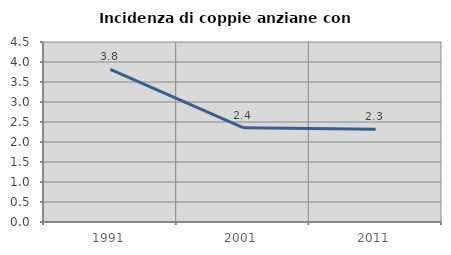
| Category | Incidenza di coppie anziane con figli |
|---|---|
| 1991.0 | 3.817 |
| 2001.0 | 2.357 |
| 2011.0 | 2.318 |